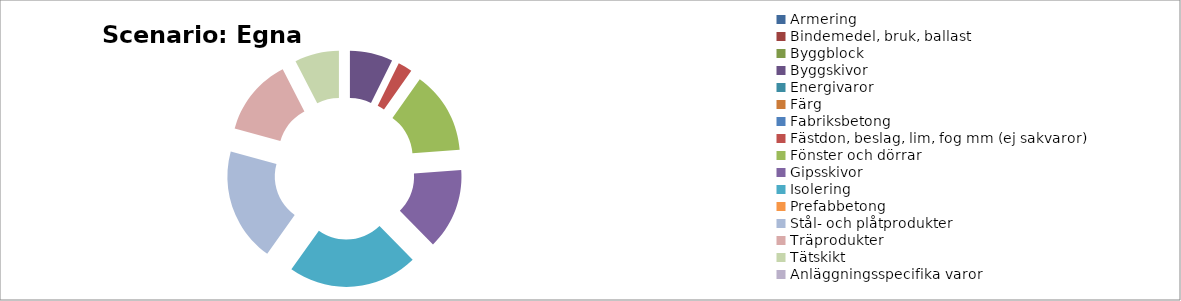
| Category | Scenario: Egna val |
|---|---|
| Armering | 0 |
| Bindemedel, bruk, ballast | 0 |
| Byggblock | 0 |
| Byggskivor | 5.07 |
| Energivaror | 0 |
| Färg | 0 |
| Fabriksbetong | 0 |
| Fästdon, beslag, lim, fog mm (ej sakvaror) | 1.69 |
| Fönster och dörrar | 9.71 |
| Gipsskivor | 9.57 |
| Isolering | 15.33 |
| Prefabbetong | 0 |
| Stål- och plåtprodukter | 13.42 |
| Träprodukter | 9.11 |
| Tätskikt | 5.23 |
| Anläggningsspecifika varor | 0 |